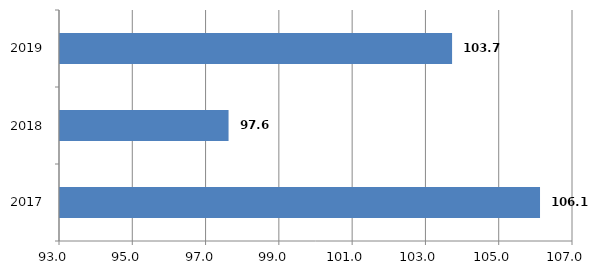
| Category | Series 0 |
|---|---|
| 2017.0 | 106.1 |
| 2018.0 | 97.6 |
| 2019.0 | 103.7 |